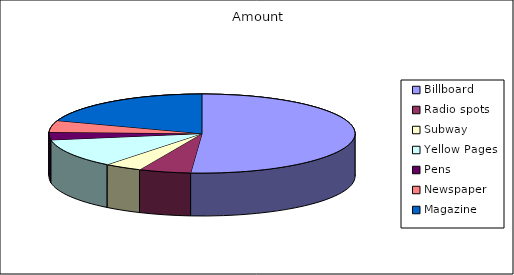
| Category | Amount |
|---|---|
| Billboard | 6500 |
| Radio spots | 700 |
| Subway | 500 |
| Yellow Pages | 1500 |
| Pens | 400 |
| Newspaper | 600 |
| Magazine | 2500 |